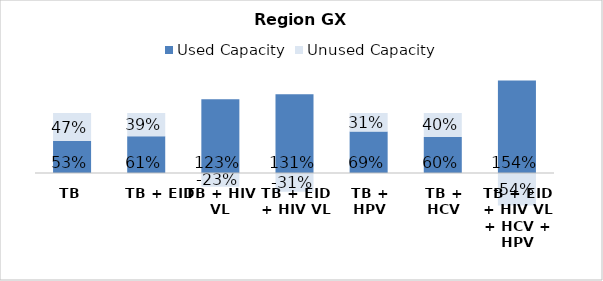
| Category | Used Capacity | Unused Capacity |
|---|---|---|
| TB | 0.532 | 0.468 |
| TB + EID | 0.614 | 0.386 |
| TB + HIV VL | 1.231 | -0.231 |
| TB + EID + HIV VL | 1.313 | -0.313 |
| TB + HPV | 0.692 | 0.308 |
| TB + HCV | 0.601 | 0.399 |
| TB + EID + HIV VL + HCV + HPV | 1.541 | -0.541 |